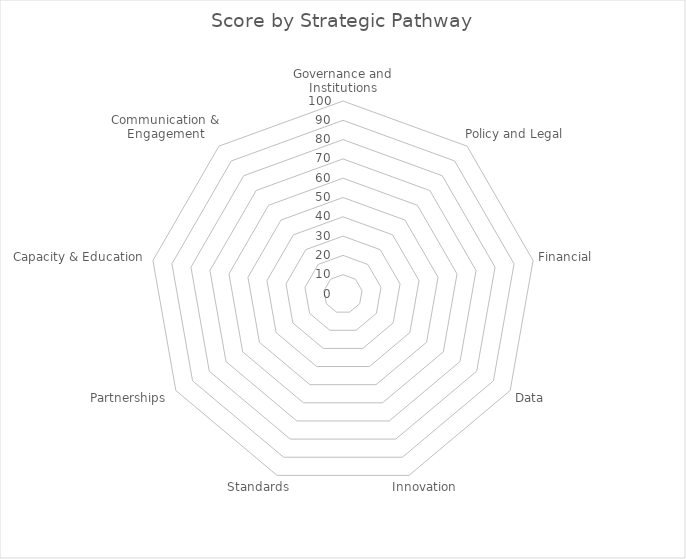
| Category | Series 0 |
|---|---|
| Governance and Institutions | 0 |
| Policy and Legal | 0 |
| Financial | 0 |
| Data | 0 |
| Innovation | 0 |
| Standards | 0 |
| Partnerships | 0 |
| Capacity & Education | 0 |
| Communication & Engagement | 0 |